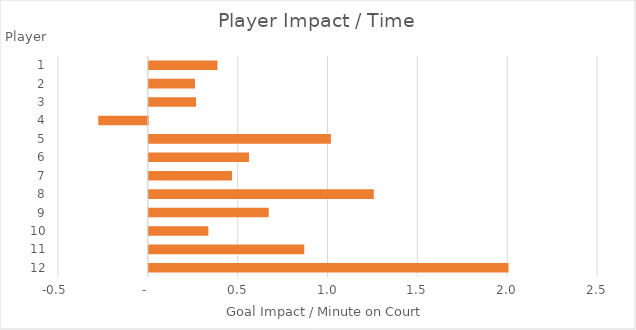
| Category | Series 1 |
|---|---|
| 0 | 0.382 |
| 1 | 0.257 |
| 2 | 0.263 |
| 3 | -0.276 |
| 4 | 1.013 |
| 5 | 0.558 |
| 6 | 0.463 |
| 7 | 1.252 |
| 8 | 0.667 |
| 9 | 0.331 |
| 10 | 0.865 |
| 11 | 2.002 |